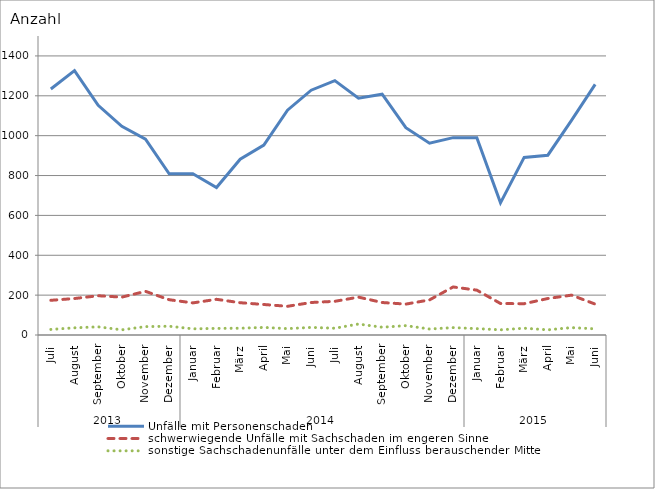
| Category | Unfälle mit Personenschaden | schwerwiegende Unfälle mit Sachschaden im engeren Sinne | sonstige Sachschadenunfälle unter dem Einfluss berauschender Mittel |
|---|---|---|---|
| 0 | 1234 | 174 | 28 |
| 1 | 1326 | 183 | 36 |
| 2 | 1152 | 197 | 41 |
| 3 | 1047 | 190 | 26 |
| 4 | 983 | 219 | 42 |
| 5 | 809 | 177 | 44 |
| 6 | 809 | 161 | 31 |
| 7 | 740 | 179 | 33 |
| 8 | 882 | 162 | 34 |
| 9 | 953 | 153 | 38 |
| 10 | 1128 | 144 | 32 |
| 11 | 1228 | 163 | 38 |
| 12 | 1276 | 169 | 34 |
| 13 | 1188 | 190 | 55 |
| 14 | 1208 | 163 | 39 |
| 15 | 1040 | 155 | 47 |
| 16 | 962 | 176 | 30 |
| 17 | 990 | 241 | 37 |
| 18 | 989 | 225 | 32 |
| 19 | 663 | 158 | 26 |
| 20 | 891 | 157 | 34 |
| 21 | 902 | 183 | 26 |
| 22 | 1077 | 200 | 37 |
| 23 | 1257 | 155 | 31 |